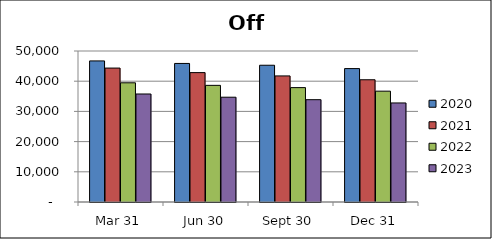
| Category | 2020 | 2021 | 2022 | 2023 |
|---|---|---|---|---|
| Mar 31 | 46718 | 44349 | 39468 | 35763 |
| Jun 30 | 45880 | 42840 | 38627 | 34699 |
| Sept 30 | 45283 | 41751 | 37873 | 33879 |
| Dec 31 | 44179 | 40476 | 36702 | 32798 |